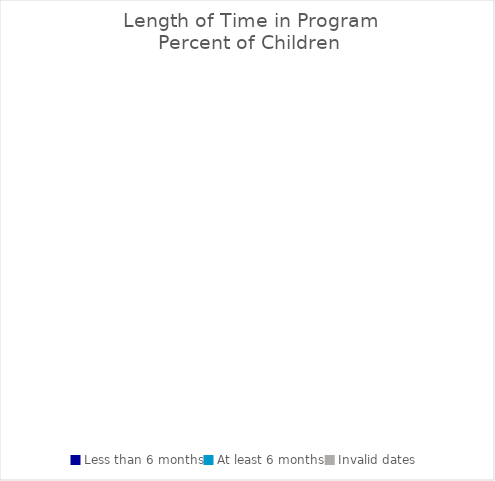
| Category | Percent of Children |
|---|---|
| Less than 6 months | 0 |
| At least 6 months | 0 |
| Invalid dates | 0 |